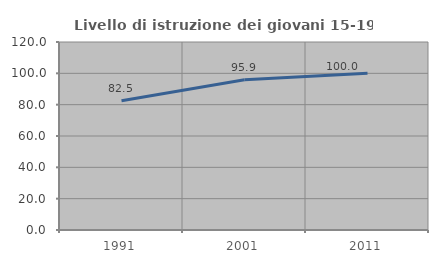
| Category | Livello di istruzione dei giovani 15-19 anni |
|---|---|
| 1991.0 | 82.54 |
| 2001.0 | 95.918 |
| 2011.0 | 100 |